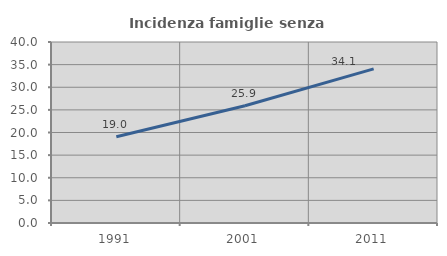
| Category | Incidenza famiglie senza nuclei |
|---|---|
| 1991.0 | 19.048 |
| 2001.0 | 25.926 |
| 2011.0 | 34.056 |